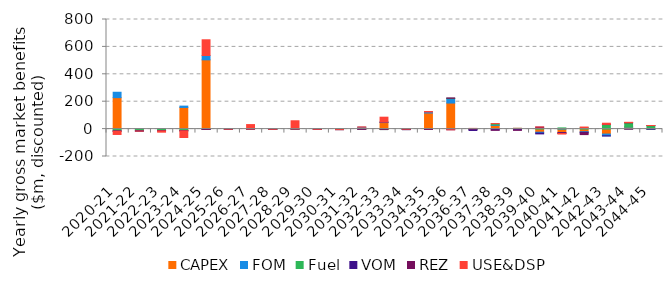
| Category | CAPEX | FOM | Fuel | VOM | REZ | USE&DSP |
|---|---|---|---|---|---|---|
| 2020-21 | 229.595 | 39.349 | -13.093 | -1.924 | 0 | -24.193 |
| 2021-22 | -0.001 | 0 | -11.886 | -2.252 | 0 | -0.016 |
| 2022-23 | -0.003 | 0 | -10.943 | -2.064 | 0 | -9.369 |
| 2023-24 | 157.911 | 9.88 | -10.713 | -1.896 | 0 | -48.632 |
| 2024-25 | 505.472 | 31.69 | -2.17 | -0.398 | 0 | 114.815 |
| 2025-26 | 0 | 0 | 0.362 | -0.313 | 0 | 0 |
| 2026-27 | 0.001 | 0 | 1.17 | -0.195 | 0 | 31.837 |
| 2027-28 | -0.001 | 0 | -0.334 | -0.472 | 0 | 0 |
| 2028-29 | 0 | 0 | 2.098 | 0.05 | 0 | 58.639 |
| 2029-30 | 0 | 0 | -0.803 | -0.388 | 0 | 0 |
| 2030-31 | -0.001 | 0 | -3.184 | -0.516 | 0 | 0 |
| 2031-32 | 11.782 | 2.439 | -0.467 | -0.852 | 0 | 2.039 |
| 2032-33 | 47.771 | 3.031 | -3.377 | 0.153 | 0 | 36.003 |
| 2033-34 | -0.001 | 0 | -3.188 | -0.392 | 0 | 3.686 |
| 2034-35 | 117.548 | 7.483 | -1.339 | -0.799 | 0 | 3.606 |
| 2035-36 | 190.135 | 31.944 | 2.598 | -4.43 | 3.003 | -0.926 |
| 2036-37 | -0.422 | -1.055 | 1.623 | -8.573 | 2.197 | 1.344 |
| 2037-38 | 26.626 | 4.408 | 8.441 | -6.86 | -1.609 | 0.798 |
| 2038-39 | 1.991 | 0.9 | 2.636 | -6.544 | -2.273 | 0.18 |
| 2039-40 | -22.859 | -6.103 | 7.195 | -6.035 | 7.8 | 0.283 |
| 2040-41 | -25.013 | 2.541 | 6.136 | -5.454 | -0.615 | -4.957 |
| 2041-42 | -19.07 | -3.97 | 11.759 | -4.778 | -12.232 | 3.308 |
| 2042-43 | -36.164 | -12.943 | 33.206 | -1.195 | 1.202 | 8.549 |
| 2043-44 | 14.592 | 0.975 | 30.177 | -0.338 | 1.23 | 2.577 |
| 2044-45 | 0.135 | 0.329 | 25.056 | -0.6 | 0.45 | 0.314 |